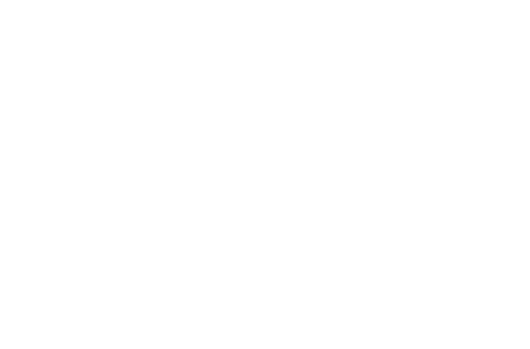
| Category | Principal Paid | Interest Paid |
|---|---|---|
| 2019 | 444.931 | 314.753 |
| 2020 | 1241.601 | 820.398 |
| 2021 | 2083.21 | 1281.104 |
| 2022 | 2972.292 | 1694.338 |
| 2023 | 3911.526 | 2057.42 |
| 2024 | 4903.739 | 2367.521 |
| 2025 | 5951.921 | 2621.655 |
| 2026 | 7059.229 | 2816.662 |
| 2027 | 8228.998 | 2949.209 |
| 2028 | 9464.751 | 3015.771 |
| 2029 | 10000 | 3023.153 |